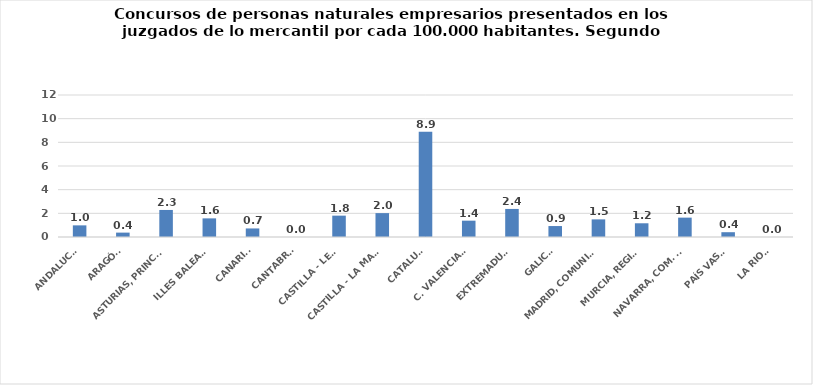
| Category | Series 0 |
|---|---|
| ANDALUCÍA | 0.983 |
| ARAGÓN | 0.371 |
| ASTURIAS, PRINCIPADO | 2.285 |
| ILLES BALEARS | 1.575 |
| CANARIAS | 0.723 |
| CANTABRIA | 0 |
| CASTILLA - LEÓN | 1.805 |
| CASTILLA - LA MANCHA | 2.019 |
| CATALUÑA | 8.9 |
| C. VALENCIANA | 1.38 |
| EXTREMADURA | 2.371 |
| GALICIA | 0.926 |
| MADRID, COMUNIDAD | 1.489 |
| MURCIA, REGIÓN | 1.159 |
| NAVARRA, COM. FORAL | 1.636 |
| PAÍS VASCO | 0.405 |
| LA RIOJA | 0 |